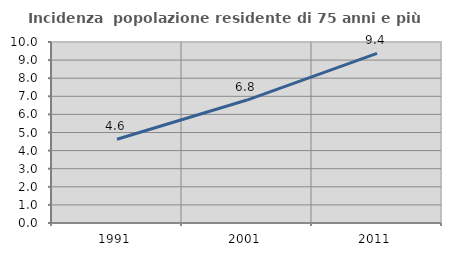
| Category | Incidenza  popolazione residente di 75 anni e più |
|---|---|
| 1991.0 | 4.628 |
| 2001.0 | 6.793 |
| 2011.0 | 9.369 |